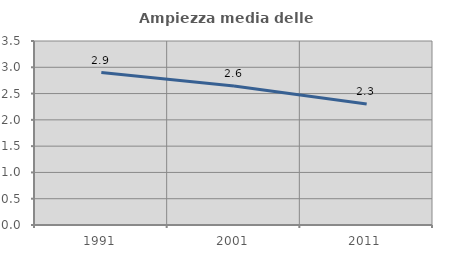
| Category | Ampiezza media delle famiglie |
|---|---|
| 1991.0 | 2.9 |
| 2001.0 | 2.643 |
| 2011.0 | 2.302 |